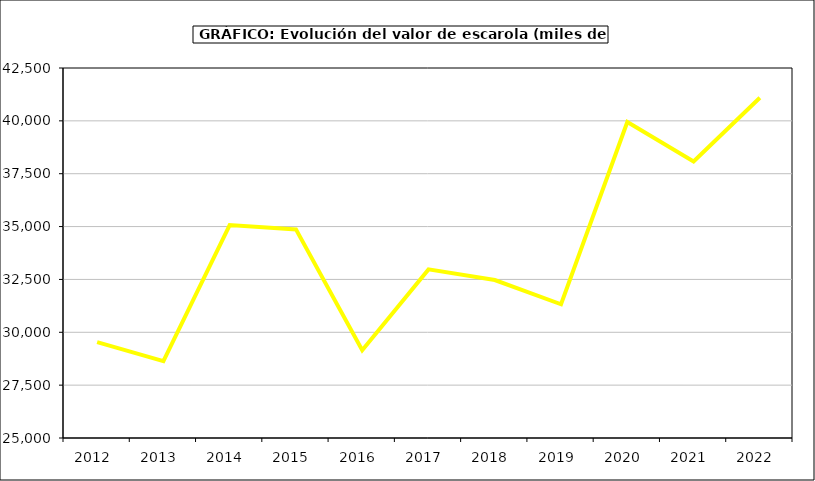
| Category | Valor |
|---|---|
| 2012.0 | 29537.457 |
| 2013.0 | 28639.256 |
| 2014.0 | 35074.052 |
| 2015.0 | 34867 |
| 2016.0 | 29152 |
| 2017.0 | 32975.446 |
| 2018.0 | 32472.175 |
| 2019.0 | 31324.351 |
| 2020.0 | 39947.279 |
| 2021.0 | 38074.827 |
| 2022.0 | 41091.3 |